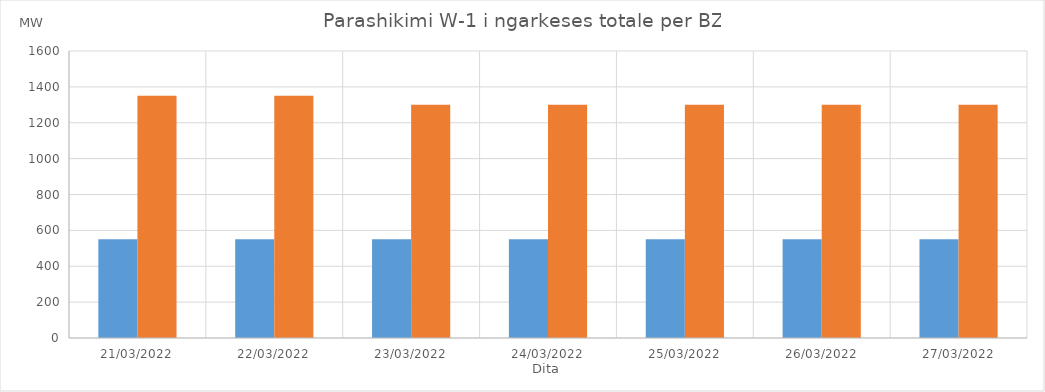
| Category | Min (MW) | Max (MW) |
|---|---|---|
| 21/03/2022 | 550 | 1350 |
| 22/03/2022 | 550 | 1350 |
| 23/03/2022 | 550 | 1300 |
| 24/03/2022 | 550 | 1300 |
| 25/03/2022 | 550 | 1300 |
| 26/03/2022 | 550 | 1300 |
| 27/03/2022 | 550 | 1300 |